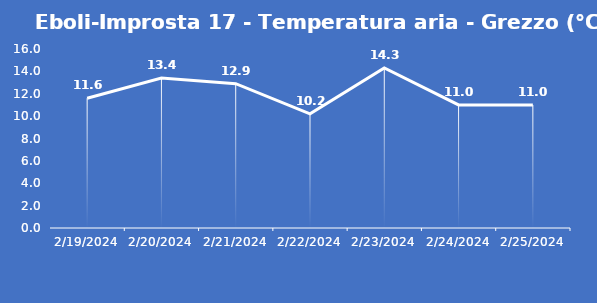
| Category | Eboli-Improsta 17 - Temperatura aria - Grezzo (°C) |
|---|---|
| 2/19/24 | 11.6 |
| 2/20/24 | 13.4 |
| 2/21/24 | 12.9 |
| 2/22/24 | 10.2 |
| 2/23/24 | 14.3 |
| 2/24/24 | 11 |
| 2/25/24 | 11 |